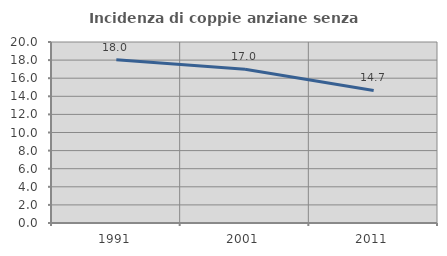
| Category | Incidenza di coppie anziane senza figli  |
|---|---|
| 1991.0 | 18.026 |
| 2001.0 | 16.981 |
| 2011.0 | 14.652 |